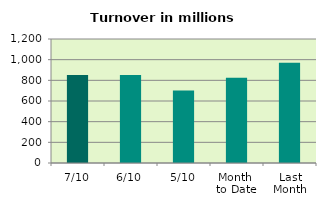
| Category | Series 0 |
|---|---|
| 7/10 | 850.773 |
| 6/10 | 852.466 |
| 5/10 | 702.477 |
| Month 
to Date | 825.503 |
| Last
Month | 970.98 |